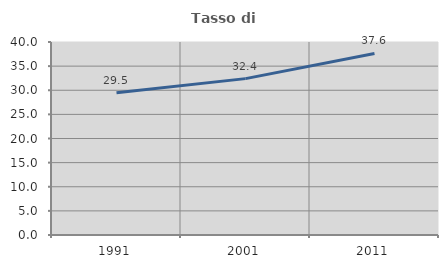
| Category | Tasso di occupazione   |
|---|---|
| 1991.0 | 29.502 |
| 2001.0 | 32.411 |
| 2011.0 | 37.625 |